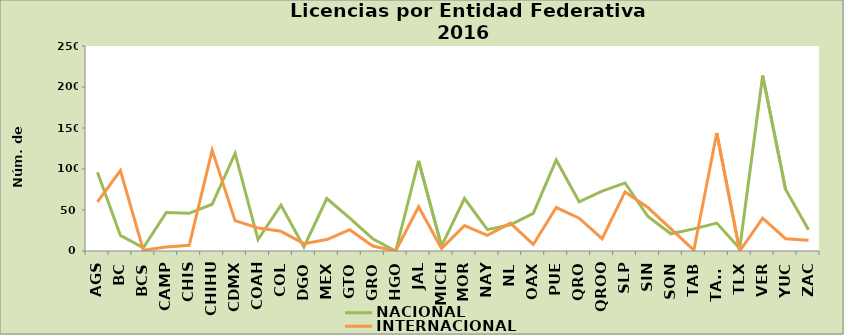
| Category | NACIONAL | INTERNACIONAL |
|---|---|---|
| AGS | 96 | 60 |
| BC | 19 | 98 |
| BCS | 4 | 1 |
| CAMP | 47 | 5 |
| CHIS | 46 | 7 |
| CHIHU | 57 | 123 |
| CDMX | 119 | 37 |
| COAH | 14 | 28 |
| COL | 56 | 24 |
| DGO | 5 | 9 |
| MEX | 64 | 14 |
| GTO | 40 | 26 |
| GRO | 15 | 6 |
| HGO | 0 | 0 |
| JAL | 110 | 54 |
| MICH | 6 | 3 |
| MOR | 64 | 31 |
| NAY | 26 | 19 |
| NL | 32 | 34 |
| OAX | 46 | 8 |
| PUE | 111 | 53 |
| QRO | 60 | 40 |
| QROO | 73 | 15 |
| SLP | 83 | 72 |
| SIN | 42 | 53 |
| SON | 21 | 27 |
| TAB | 27 | 1 |
| TAMS | 34 | 144 |
| TLX | 3 | 0 |
| VER | 214 | 40 |
| YUC | 75 | 15 |
| ZAC | 26 | 13 |